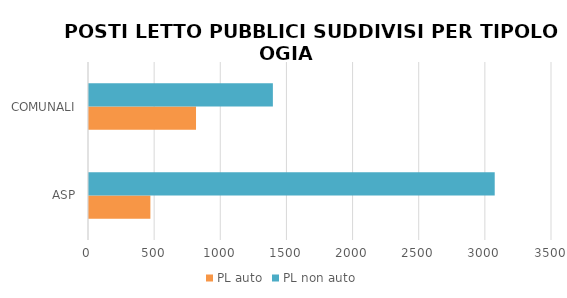
| Category | PL auto | PL non auto |
|---|---|---|
| ASP | 464 | 3067 |
| COMUNALI | 809 | 1390 |